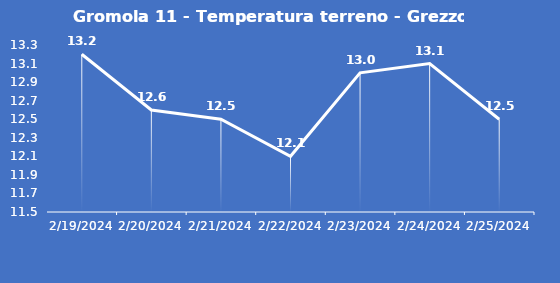
| Category | Gromola 11 - Temperatura terreno - Grezzo (°C) |
|---|---|
| 2/19/24 | 13.2 |
| 2/20/24 | 12.6 |
| 2/21/24 | 12.5 |
| 2/22/24 | 12.1 |
| 2/23/24 | 13 |
| 2/24/24 | 13.1 |
| 2/25/24 | 12.5 |